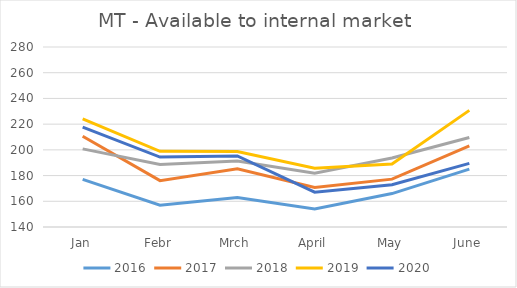
| Category | 2016 | 2017 | 2018 | 2019 | 2020 |
|---|---|---|---|---|---|
| Jan | 177 | 210.608 | 200.782 | 224.173 | 217.644 |
| Febr | 157 | 176.034 | 188.557 | 198.905 | 194.373 |
| Mrch | 163 | 185.369 | 191.325 | 198.658 | 195.313 |
| April | 154 | 170.669 | 181.752 | 185.742 | 167.121 |
| May | 166 | 177.217 | 193.642 | 189.026 | 172.936 |
| June | 185 | 203.13 | 209.607 | 230.716 | 189.51 |